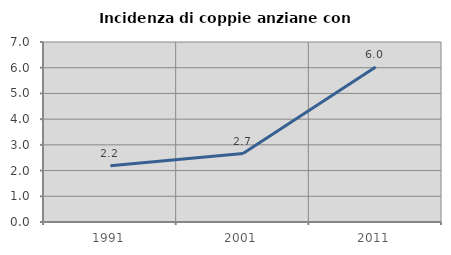
| Category | Incidenza di coppie anziane con figli |
|---|---|
| 1991.0 | 2.19 |
| 2001.0 | 2.662 |
| 2011.0 | 6.028 |